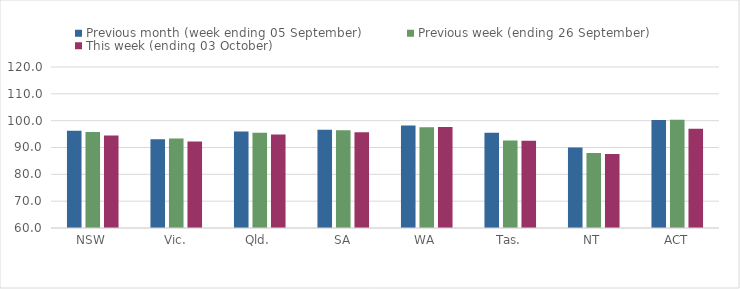
| Category | Previous month (week ending 05 September) | Previous week (ending 26 September) | This week (ending 03 October) |
|---|---|---|---|
| NSW | 96.25 | 95.82 | 94.46 |
| Vic. | 93.03 | 93.33 | 92.2 |
| Qld. | 95.97 | 95.46 | 94.8 |
| SA | 96.65 | 96.42 | 95.66 |
| WA | 98.21 | 97.55 | 97.62 |
| Tas. | 95.48 | 92.61 | 92.48 |
| NT | 90.01 | 87.94 | 87.6 |
| ACT | 100.23 | 100.35 | 97 |